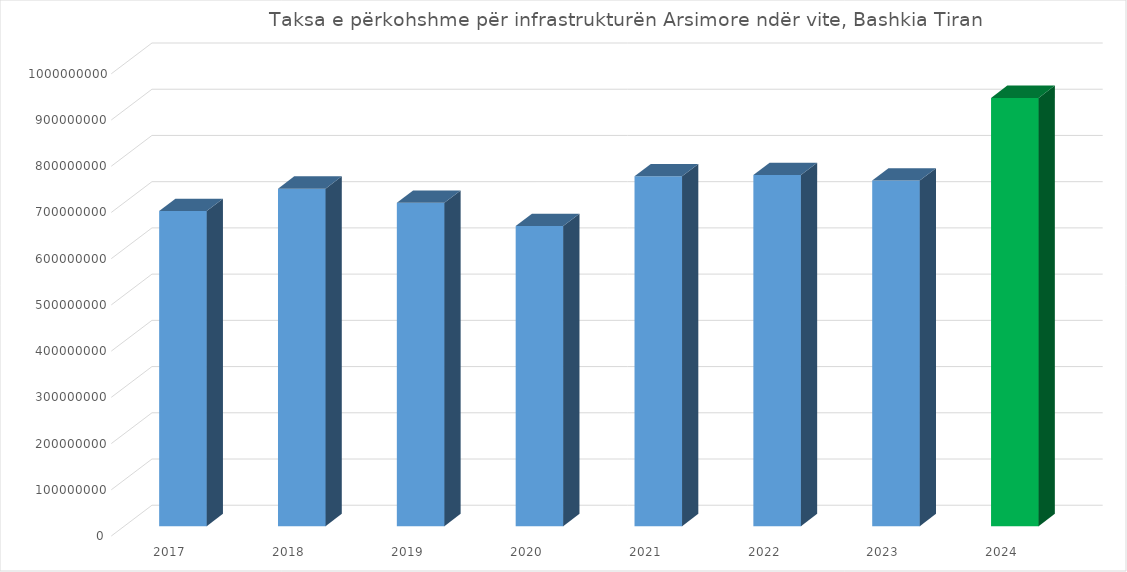
| Category | Taksa e përkohshme për infrastrukturën Arsimore |
|---|---|
| 2017.0 | 681927166 |
| 2018.0 | 730095161 |
| 2019.0 | 699773149 |
| 2020.0 | 649392794 |
| 2021.0 | 756967278 |
| 2022.0 | 759519645 |
| 2023.0 | 747727133 |
| 2024.0 | 926500000 |